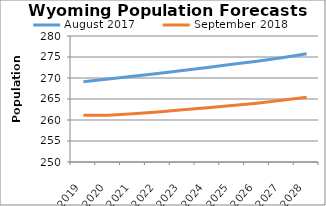
| Category | August 2017 | September 2018 |
|---|---|---|
| 2019.0 | 269.133 | 261.118 |
| 2020.0 | 269.743 | 261.155 |
| 2021.0 | 270.391 | 261.481 |
| 2022.0 | 271.078 | 261.931 |
| 2023.0 | 271.788 | 262.417 |
| 2024.0 | 272.526 | 262.937 |
| 2025.0 | 273.264 | 263.462 |
| 2026.0 | 273.972 | 264.007 |
| 2027.0 | 274.829 | 264.682 |
| 2028.0 | 275.78 | 265.429 |